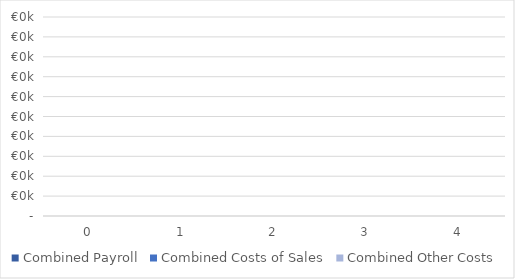
| Category | Combined Payroll | Combined Costs of Sales | Combined Other Costs |
|---|---|---|---|
| 0.0 | 0 | 0 | 0 |
| 1.0 | 0 | 0 | 0 |
| 2.0 | 0 | 0 | 0 |
| 3.0 | 0 | 0 | 0 |
| 4.0 | 0 | 0 | 0 |